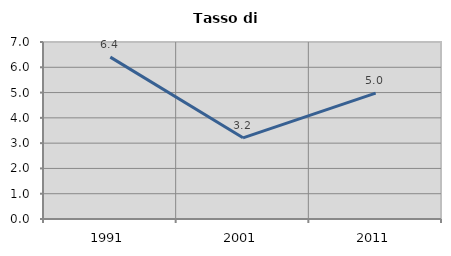
| Category | Tasso di disoccupazione   |
|---|---|
| 1991.0 | 6.402 |
| 2001.0 | 3.21 |
| 2011.0 | 4.976 |